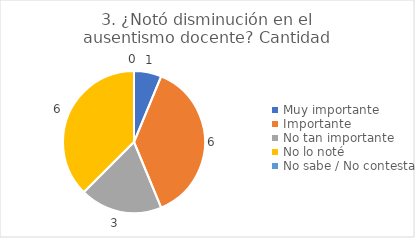
| Category | 3. ¿Notó disminución en el ausentismo docente? |
|---|---|
| Muy importante  | 0.062 |
| Importante  | 0.375 |
| No tan importante  | 0.188 |
| No lo noté  | 0.375 |
| No sabe / No contesta | 0 |